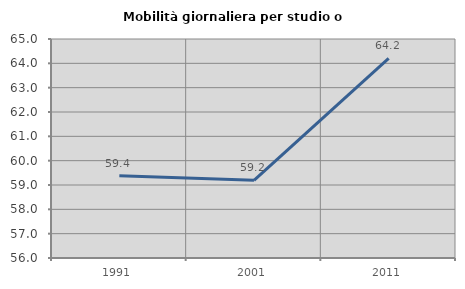
| Category | Mobilità giornaliera per studio o lavoro |
|---|---|
| 1991.0 | 59.383 |
| 2001.0 | 59.191 |
| 2011.0 | 64.208 |